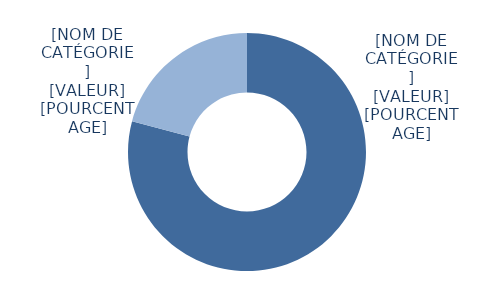
| Category | Series 0 |
|---|---|
| Formation de base | 14936 |
| Formation avancée | 3929 |